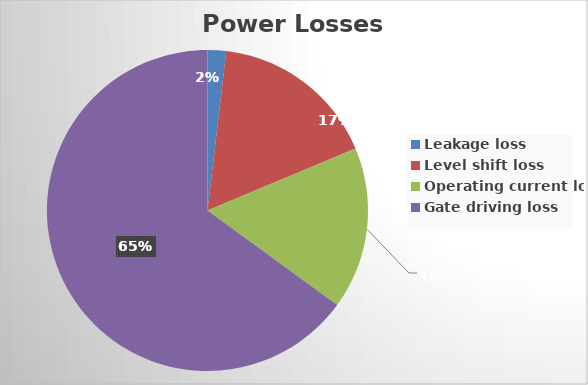
| Category | Series 0 |
|---|---|
| Leakage loss | 4.14 |
| Level shift loss | 37.26 |
| Operating current loss | 36.24 |
| Gate driving loss | 144 |